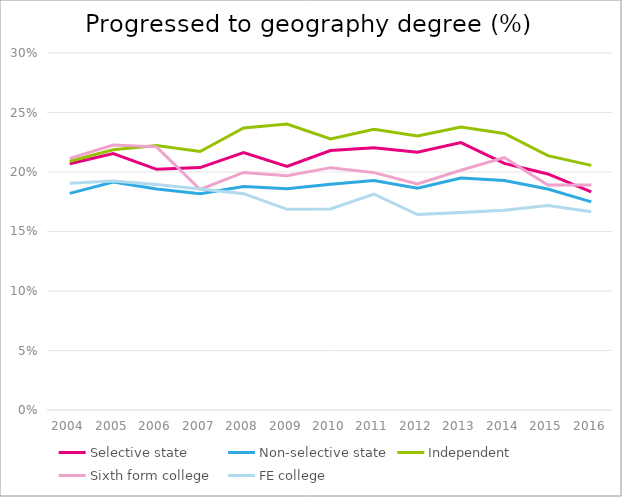
| Category | Selective state | Non-selective state | Independent | Sixth form college | FE college |
|---|---|---|---|---|---|
| 2004.0 | 0.207 | 0.182 | 0.209 | 0.211 | 0.191 |
| 2005.0 | 0.216 | 0.192 | 0.219 | 0.223 | 0.192 |
| 2006.0 | 0.202 | 0.186 | 0.222 | 0.221 | 0.189 |
| 2007.0 | 0.204 | 0.182 | 0.217 | 0.185 | 0.186 |
| 2008.0 | 0.216 | 0.188 | 0.237 | 0.2 | 0.182 |
| 2009.0 | 0.205 | 0.186 | 0.24 | 0.197 | 0.169 |
| 2010.0 | 0.218 | 0.19 | 0.228 | 0.204 | 0.169 |
| 2011.0 | 0.22 | 0.193 | 0.236 | 0.199 | 0.181 |
| 2012.0 | 0.217 | 0.186 | 0.23 | 0.19 | 0.164 |
| 2013.0 | 0.225 | 0.195 | 0.238 | 0.201 | 0.166 |
| 2014.0 | 0.207 | 0.193 | 0.232 | 0.212 | 0.168 |
| 2015.0 | 0.198 | 0.186 | 0.214 | 0.189 | 0.172 |
| 2016.0 | 0.183 | 0.175 | 0.206 | 0.189 | 0.167 |